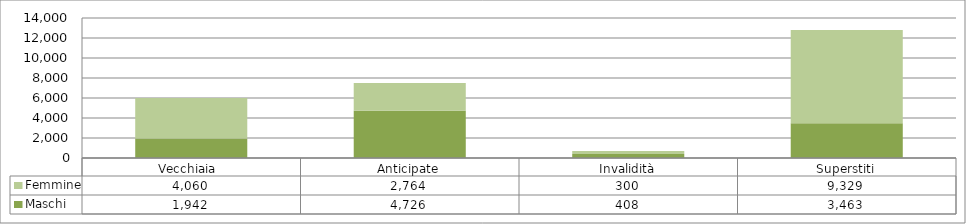
| Category | Maschi | Femmine |
|---|---|---|
| Vecchiaia  | 1942 | 4060 |
| Anticipate | 4726 | 2764 |
| Invalidità | 408 | 300 |
| Superstiti | 3463 | 9329 |